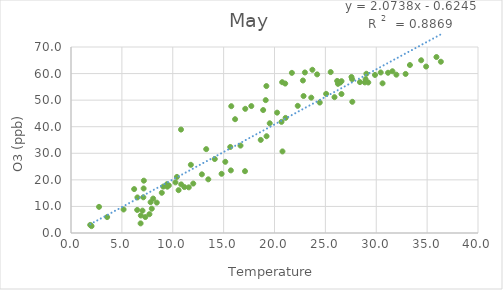
| Category | Series 0 |
|---|---|
| 7.160000000000025 | 19.693 |
| 7.139166666666995 | 16.759 |
| 6.525833333333992 | 13.386 |
| 5.169166666667024 | 8.847 |
| 3.5533333333330006 | 5.999 |
| 2.7549999999999955 | 9.832 |
| 2.0183333333329756 | 2.584 |
| 1.8891666666669948 | 3.043 |
| 6.207499999999982 | 16.527 |
| 10.810833333332994 | 38.926 |
| 15.751666666667006 | 47.723 |
| 19.201666666666995 | 55.302 |
| 21.053333333333 | 56.244 |
| 22.79333333333301 | 57.394 |
| 24.189999999999998 | 59.696 |
| 25.520833333332973 | 60.558 |
| 22.98666666666702 | 60.421 |
| 23.722500000000025 | 61.422 |
| 21.709836065573995 | 60.263 |
| 20.754166666667004 | 56.754 |
| 18.885833333332982 | 46.271 |
| 14.129999999999995 | 27.836 |
| 10.573333333332982 | 16.116 |
| 8.925000000000011 | 15.133 |
| 8.074166666666997 | 12.958 |
| 7.024166666666986 | 8.418 |
| 6.506666666667002 | 8.674 |
| 7.109166666667022 | 13.436 |
| 7.822499999999991 | 11.597 |
| 7.302500000000009 | 6.003 |
| 7.708333333332973 | 7.074 |
| 8.427500000000009 | 11.433 |
| 11.145833333332973 | 17.285 |
| 15.653333333333023 | 32.374 |
| 20.256666666667 | 45.293 |
| 22.857500000000016 | 51.546 |
| 26.160833333333017 | 57.228 |
| 27.564166666667006 | 58.725 |
| 29.03083333333302 | 59.925 |
| 29.87583333333299 | 59.481 |
| 27.627499999999998 | 57.886 |
| 26.585833333333028 | 57.132 |
| 26.460655737704997 | 56.621 |
| 26.23750000000001 | 56.142 |
| 25.07499999999999 | 52.362 |
| 18.648333333333028 | 35.036 |
| 15.164166666666972 | 26.793 |
| 12.863333333333003 | 22.08 |
| 11.574166666666997 | 17.181 |
| 10.83166666666699 | 18.287 |
| 10.265833333332978 | 19.049 |
| 9.617500000000007 | 17.901 |
| 9.068333333332987 | 17.461 |
| 7.9383333333329915 | 9.142 |
| 6.841666666666981 | 3.62 |
| 6.86166666666702 | 6.589 |
| 12.014999999999986 | 18.607 |
| 16.659166666666977 | 32.894 |
| 21.089999999999975 | 43.313 |
| 25.89749999999998 | 51.117 |
| 29.215833333333023 | 56.644 |
| 30.439166666667006 | 60.411 |
| 33.30916666666701 | 63.221 |
| 31.15666666666698 | 60.309 |
| 28.877499999999998 | 56.68 |
| 28.951666666666995 | 57.884 |
| 26.58360655737698 | 52.302 |
| 23.614166666667018 | 50.938 |
| 22.284166666666977 | 47.857 |
| 20.6875 | 41.816 |
| 19.53083333333302 | 41.288 |
| 19.136666666666997 | 50.005 |
| 17.72083333333302 | 47.772 |
| 17.126666666667006 | 46.731 |
| 16.126666666667006 | 42.825 |
| 13.289166666666972 | 31.56 |
| 11.779166666666981 | 25.663 |
| 10.410833333333017 | 21.11 |
| 9.429166666667015 | 18.363 |
| 9.464166666666983 | 17.428 |
| 13.492500000000007 | 20.197 |
| 19.21916666666698 | 36.416 |
| 24.444999999999993 | 49.088 |
| 28.399166666666986 | 56.781 |
| 31.590833333333023 | 60.873 |
| 34.41500000000002 | 65.006 |
| 35.91666666666703 | 66.224 |
| 36.35000000000002 | 64.457 |
| 34.90166666666698 | 62.646 |
| 32.88583333333298 | 59.861 |
| 31.97622950819698 | 59.586 |
| 30.619166666667013 | 56.328 |
| 27.646666666666988 | 49.375 |
| 20.78333333333302 | 30.699 |
| 17.100833333333014 | 23.263 |
| 15.709166666666988 | 23.562 |
| 14.800000000000011 | 22.275 |